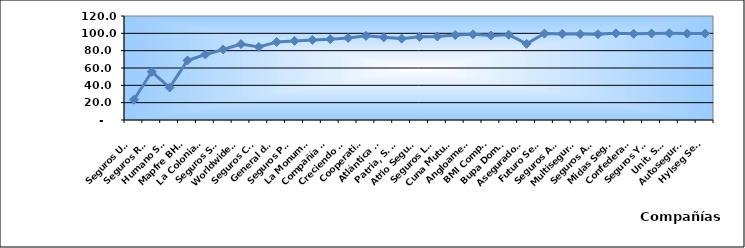
| Category | Series 0 |
|---|---|
| Seguros Universal, S. A. | 23.432 |
| Seguros Reservas, S. A. | 55.607 |
| Humano Seguros, S. A. | 37.461 |
| Mapfre BHD Compañía de Seguros | 68.686 |
| La Colonial, S. A., Compañia De Seguros | 75.613 |
| Seguros Sura, S.A. | 81.34 |
| Worldwide Seguros, S. A. | 87.624 |
| Seguros Crecer, S. A. | 84.352 |
| General de Seguros, S. A. | 89.988 |
| Seguros Pepín, S. A. | 91.29 |
| La Monumental de Seguros, S. A. | 92.427 |
| Compañía Dominicana de Seguros, C. por A. | 93.265 |
| Creciendo Seguros | 94.698 |
| Cooperativa Nacional De Seguros, Inc  | 97.074 |
| Atlántica Seguros, S. A. | 95.35 |
| Patria, S. A., Compañía de Seguros | 93.9 |
| Atrio Seguros S. A. | 95.932 |
| Seguros La Internacional, S. A. | 96.405 |
| Cuna Mutual Insurance Society Dominicana | 97.957 |
| Angloamericana de Seguros, S. A. | 98.815 |
| BMI Compañía de Seguros, S. A. | 97.498 |
| Bupa Dominicana, S. A. | 98.366 |
| Aseguradora Agropecuaria Dominicana, S. A. | 87.904 |
| Futuro Seguros | 99.726 |
| Seguros Ademi, S.A. | 99.368 |
| Multiseguros Su, S.A. | 99.127 |
| Seguros APS, S.R.L. | 98.955 |
| Midas Seguros, S.A. | 99.952 |
| Confederación del Canadá Dominicana, S. A. | 99.464 |
| Seguros Yunen, S.A. | 99.835 |
| Unit, S.A. | 100 |
| Autoseguro, S. A. | 99.77 |
| Hylseg Seguros S.A | 99.844 |